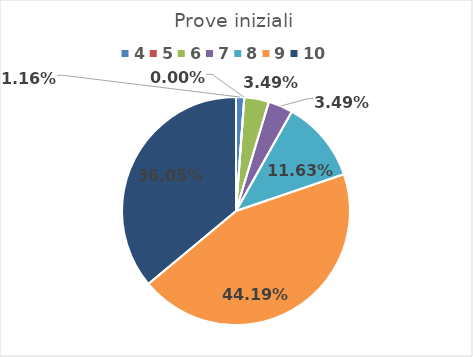
| Category | Series 0 |
|---|---|
| 4.0 | 0.012 |
| 5.0 | 0 |
| 6.0 | 0.035 |
| 7.0 | 0.035 |
| 8.0 | 0.116 |
| 9.0 | 0.442 |
| 10.0 | 0.36 |